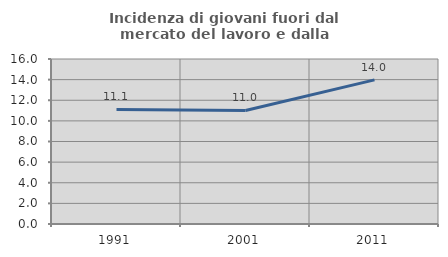
| Category | Incidenza di giovani fuori dal mercato del lavoro e dalla formazione  |
|---|---|
| 1991.0 | 11.111 |
| 2001.0 | 11.009 |
| 2011.0 | 13.978 |